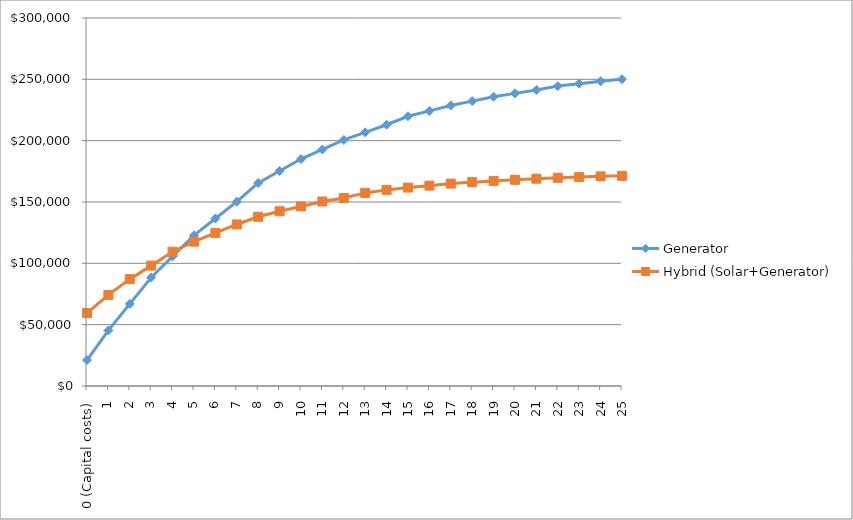
| Category | Generator | Hybrid (Solar+Generator) |
|---|---|---|
| 0 (Capital costs) | 21128.571 | 59426.149 |
| 1 | 45313.851 | 74285.149 |
| 2 | 66907.851 | 87094.631 |
| 3 | 88460.211 | 98137.289 |
| 4 | 105674.816 | 109482.696 |
| 5 | 122856.225 | 117689.189 |
| 6 | 136579.602 | 124763.752 |
| 7 | 150276.517 | 131693.659 |
| 8 | 165514.026 | 137959.627 |
| 9 | 175282.055 | 142492 |
| 10 | 185031.248 | 146399.218 |
| 11 | 192818.261 | 150413.558 |
| 12 | 200590.258 | 153317.258 |
| 13 | 206798.017 | 157420.844 |
| 14 | 212993.806 | 159872.85 |
| 15 | 219886.481 | 161733.127 |
| 16 | 224305.042 | 163336.815 |
| 17 | 228715.081 | 164984.47 |
| 18 | 232237.531 | 166176.271 |
| 19 | 235753.187 | 167203.685 |
| 20 | 238561.262 | 168089.388 |
| 21 | 241363.922 | 168999.373 |
| 22 | 244481.819 | 169747.297 |
| 23 | 246480.551 | 170314.729 |
| 24 | 248475.429 | 170897.718 |
| 25 | 250068.806 | 171319.412 |